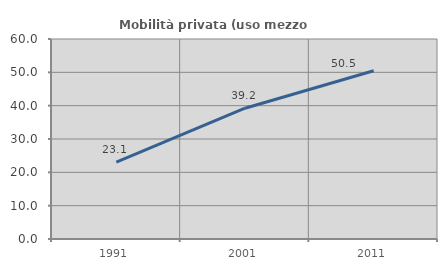
| Category | Mobilità privata (uso mezzo privato) |
|---|---|
| 1991.0 | 23.077 |
| 2001.0 | 39.233 |
| 2011.0 | 50.468 |